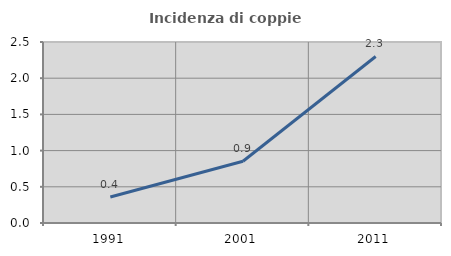
| Category | Incidenza di coppie miste |
|---|---|
| 1991.0 | 0.359 |
| 2001.0 | 0.853 |
| 2011.0 | 2.3 |